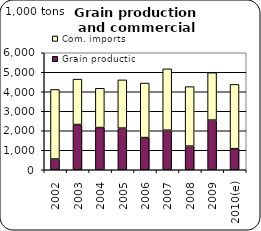
| Category | Grain production | Com. imports |
|---|---|---|
| 2002 | 550.9 | 3566.764 |
| 2003 | 2318.5 | 2330.046 |
| 2004 | 2164.5 | 2013.082 |
| 2005 | 2136.2 | 2472.405 |
| 2006 | 1649.7 | 2796.633 |
| 2007 | 2027.9 | 3147.291 |
| 2008 | 1211 | 3052 |
| 2009 | 2547 | 2431 |
| 2010(e) | 1081 | 3297.17 |